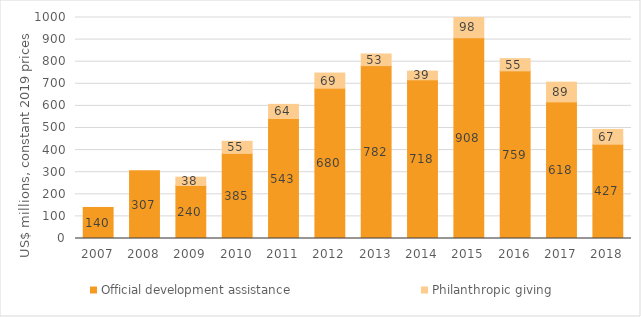
| Category | Official development assistance | Philanthropic giving |
|---|---|---|
| 2007.0 | 140.461 | 0 |
| 2008.0 | 307.084 | 0 |
| 2009.0 | 239.839 | 37.731 |
| 2010.0 | 385.115 | 54.698 |
| 2011.0 | 542.907 | 63.95 |
| 2012.0 | 680.045 | 68.567 |
| 2013.0 | 782.189 | 52.615 |
| 2014.0 | 718.115 | 39.279 |
| 2015.0 | 908.481 | 97.89 |
| 2016.0 | 758.531 | 55.289 |
| 2017.0 | 618.17 | 89.269 |
| 2018.0 | 426.654 | 66.855 |